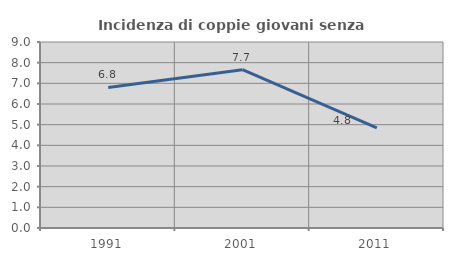
| Category | Incidenza di coppie giovani senza figli |
|---|---|
| 1991.0 | 6.802 |
| 2001.0 | 7.658 |
| 2011.0 | 4.841 |